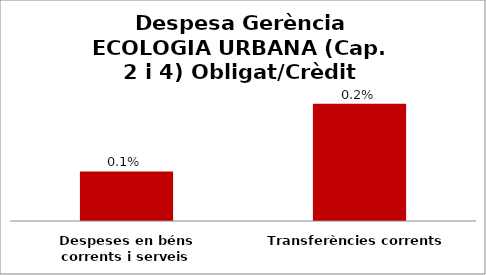
| Category | Series 0 |
|---|---|
| Despeses en béns corrents i serveis | 0.001 |
| Transferències corrents | 0.002 |